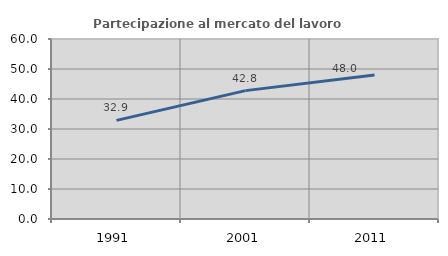
| Category | Partecipazione al mercato del lavoro  femminile |
|---|---|
| 1991.0 | 32.865 |
| 2001.0 | 42.793 |
| 2011.0 | 47.963 |